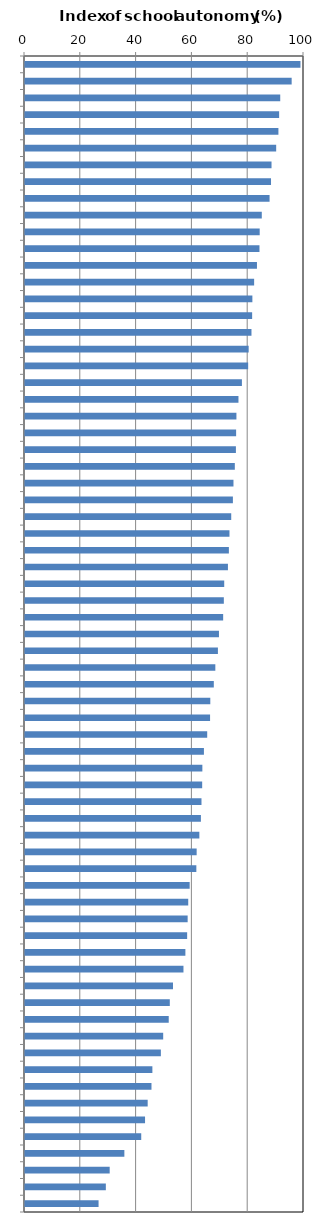
| Category | Series 0 |
|---|---|
| Macao (China) | 98.734 |
| Czech Republic | 95.576 |
| United Kingdom | 91.481 |
| Lithuania | 91.087 |
| Netherlands | 90.829 |
| Thailand | 90.028 |
| Slovak Republic | 88.36 |
| Estonia | 88.178 |
| Sweden | 87.661 |
| New Zealand | 84.871 |
| Latvia | 84.123 |
| Hong Kong (China) | 84.041 |
| Denmark | 83.14 |
| Indonesia | 82.127 |
| Iceland | 81.496 |
| Russia | 81.412 |
| Bulgaria | 81.173 |
| United States | 80.169 |
| Chile | 79.986 |
| Poland | 77.746 |
| Slovenia | 76.51 |
| Georgia | 75.779 |
| Australia | 75.672 |
| Israel | 75.592 |
| Ireland | 75.205 |
| Finland | 74.721 |
| Chinese Taipei | 74.515 |
| Singapore | 73.915 |
| Japan | 73.289 |
| Lebanon | 73.074 |
| Norway | 72.737 |
| FYROM | 71.405 |
| OECD average | 71.267 |
| Moldova | 71.024 |
| Switzerland | 69.521 |
| Belgium | 69.144 |
| Romania | 68.22 |
| Luxembourg | 67.674 |
| Colombia | 66.417 |
| Korea | 66.334 |
| Canada | 65.304 |
| Peru | 64.131 |
| Croatia | 63.57 |
| Qatar | 63.505 |
| Hungary | 63.255 |
| CABA (Argentina) | 63.049 |
| Germany | 62.494 |
| Portugal | 61.523 |
| Trinidad and Tobago | 61.414 |
| United Arab Emirates | 59.021 |
| France | 58.506 |
| Austria | 58.297 |
| Montenegro | 58.117 |
| Spain | 57.487 |
| Italy | 56.796 |
| Malta | 53.044 |
| Costa Rica | 51.903 |
| B-S-J-G (China) | 51.517 |
| Brazil | 49.53 |
| Dominican Republic | 48.697 |
| Viet Nam | 45.657 |
| Mexico | 45.333 |
| Kosovo | 43.972 |
| Algeria | 43.026 |
| Uruguay | 41.661 |
| Jordan | 35.613 |
| Tunisia | 30.355 |
| Turkey | 28.975 |
| Greece | 26.367 |